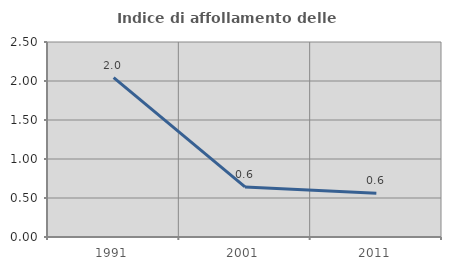
| Category | Indice di affollamento delle abitazioni  |
|---|---|
| 1991.0 | 2.043 |
| 2001.0 | 0.642 |
| 2011.0 | 0.562 |